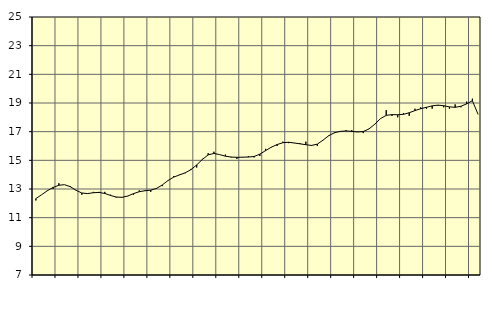
| Category | Piggar | Finansiell verksamhet, företagstjänster, SNI 64-82 |
|---|---|---|
| nan | 12.2 | 12.33 |
| 1.0 | 12.6 | 12.6 |
| 1.0 | 12.9 | 12.88 |
| 1.0 | 13 | 13.11 |
| nan | 13.4 | 13.26 |
| 2.0 | 13.3 | 13.3 |
| 2.0 | 13.2 | 13.16 |
| 2.0 | 12.9 | 12.91 |
| nan | 12.6 | 12.72 |
| 3.0 | 12.7 | 12.68 |
| 3.0 | 12.8 | 12.74 |
| 3.0 | 12.8 | 12.76 |
| nan | 12.8 | 12.69 |
| 4.0 | 12.6 | 12.55 |
| 4.0 | 12.4 | 12.44 |
| 4.0 | 12.4 | 12.42 |
| nan | 12.5 | 12.51 |
| 5.0 | 12.6 | 12.68 |
| 5.0 | 12.9 | 12.81 |
| 5.0 | 12.9 | 12.88 |
| nan | 12.8 | 12.92 |
| 6.0 | 13 | 13.04 |
| 6.0 | 13.2 | 13.28 |
| 6.0 | 13.6 | 13.59 |
| nan | 13.9 | 13.83 |
| 7.0 | 14 | 13.98 |
| 7.0 | 14.1 | 14.13 |
| 7.0 | 14.4 | 14.35 |
| nan | 14.5 | 14.68 |
| 8.0 | 15.1 | 15.07 |
| 8.0 | 15.5 | 15.38 |
| 8.0 | 15.6 | 15.48 |
| nan | 15.4 | 15.4 |
| 9.0 | 15.4 | 15.29 |
| 9.0 | 15.2 | 15.23 |
| 9.0 | 15.1 | 15.21 |
| nan | 15.2 | 15.22 |
| 10.0 | 15.3 | 15.23 |
| 10.0 | 15.2 | 15.27 |
| 10.0 | 15.3 | 15.43 |
| nan | 15.8 | 15.68 |
| 11.0 | 15.9 | 15.92 |
| 11.0 | 16 | 16.1 |
| 11.0 | 16.3 | 16.23 |
| nan | 16.2 | 16.26 |
| 12.0 | 16.2 | 16.21 |
| 12.0 | 16.2 | 16.15 |
| 12.0 | 16.3 | 16.09 |
| nan | 16 | 16.04 |
| 13.0 | 16 | 16.13 |
| 13.0 | 16.4 | 16.41 |
| 13.0 | 16.7 | 16.72 |
| nan | 16.9 | 16.93 |
| 14.0 | 17 | 17.02 |
| 14.0 | 17.1 | 17.05 |
| 14.0 | 17.1 | 17.02 |
| nan | 17 | 16.98 |
| 15.0 | 16.9 | 17.01 |
| 15.0 | 17.2 | 17.19 |
| 15.0 | 17.5 | 17.52 |
| nan | 17.9 | 17.91 |
| 16.0 | 18.5 | 18.14 |
| 16.0 | 18.1 | 18.19 |
| 16.0 | 18 | 18.18 |
| nan | 18.3 | 18.21 |
| 17.0 | 18.1 | 18.32 |
| 17.0 | 18.6 | 18.47 |
| 17.0 | 18.7 | 18.6 |
| nan | 18.6 | 18.7 |
| 18.0 | 18.6 | 18.8 |
| 18.0 | 18.8 | 18.85 |
| 18.0 | 18.7 | 18.81 |
| nan | 18.6 | 18.73 |
| 19.0 | 18.9 | 18.7 |
| 19.0 | 18.7 | 18.77 |
| 19.0 | 19.1 | 18.94 |
| nan | 19.3 | 19.16 |
| 20.0 | 18.2 | 18.2 |